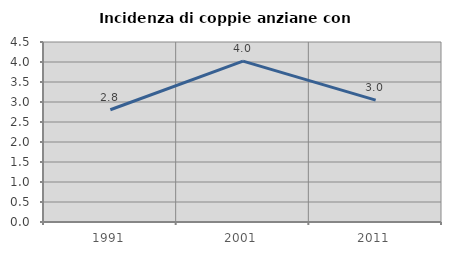
| Category | Incidenza di coppie anziane con figli |
|---|---|
| 1991.0 | 2.807 |
| 2001.0 | 4.021 |
| 2011.0 | 3.046 |